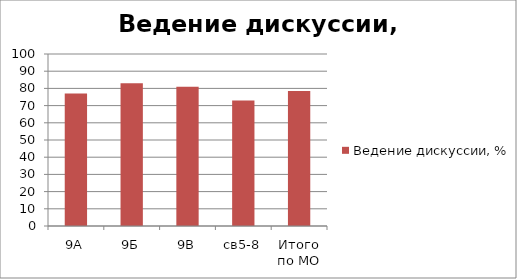
| Category | Ведение дискуссии, % |
|---|---|
| 9А | 77 |
| 9Б | 83 |
| 9В | 81 |
| св5-8 | 73 |
| Итого по МО | 78.5 |